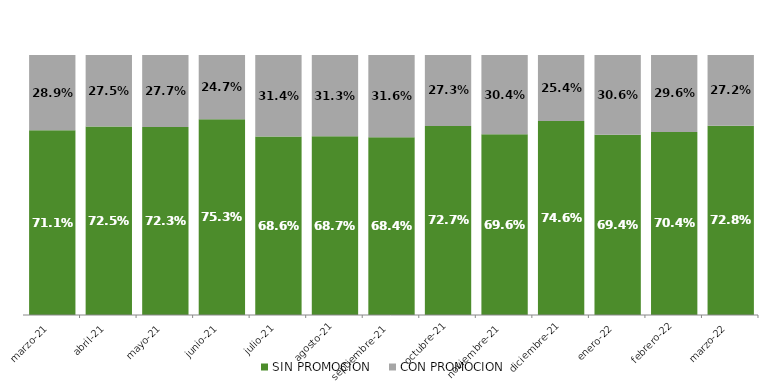
| Category | SIN PROMOCION   | CON PROMOCION   |
|---|---|---|
| 2021-03-01 | 0.711 | 0.289 |
| 2021-04-01 | 0.725 | 0.275 |
| 2021-05-01 | 0.723 | 0.277 |
| 2021-06-01 | 0.753 | 0.247 |
| 2021-07-01 | 0.686 | 0.314 |
| 2021-08-01 | 0.687 | 0.313 |
| 2021-09-01 | 0.684 | 0.316 |
| 2021-10-01 | 0.727 | 0.273 |
| 2021-11-01 | 0.696 | 0.304 |
| 2021-12-01 | 0.746 | 0.254 |
| 2022-01-01 | 0.694 | 0.306 |
| 2022-02-01 | 0.704 | 0.296 |
| 2022-03-01 | 0.728 | 0.272 |